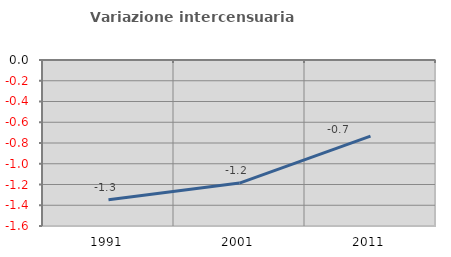
| Category | Variazione intercensuaria annua |
|---|---|
| 1991.0 | -1.346 |
| 2001.0 | -1.186 |
| 2011.0 | -0.734 |